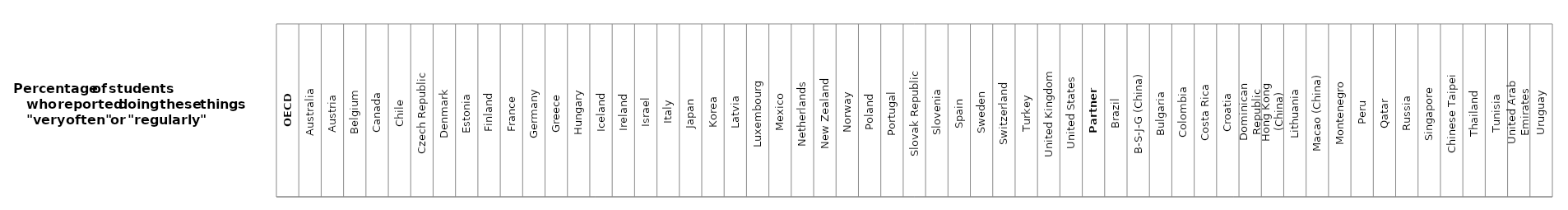
| Category | All countries and economies |
|---|---|
| OECD | 1 |
| Australia | 1 |
| Austria | 1 |
| Belgium | 1 |
| Canada | 1 |
| Chile | 1 |
| Czech Republic | 1 |
| Denmark | 1 |
| Estonia | 1 |
| Finland | 1 |
| France | 1 |
| Germany | 1 |
| Greece | 1 |
| Hungary | 1 |
| Iceland | 1 |
| Ireland | 1 |
| Israel | 1 |
| Italy | 1 |
| Japan | 1 |
| Korea | 1 |
| Latvia | 1 |
| Luxembourg | 1 |
| Mexico | 1 |
| Netherlands | 1 |
| New Zealand | 1 |
| Norway | 1 |
| Poland | 1 |
| Portugal | 1 |
| Slovak Republic | 1 |
| Slovenia | 1 |
| Spain | 1 |
| Sweden | 1 |
| Switzerland | 1 |
| Turkey | 1 |
| United Kingdom | 1 |
| United States | 1 |
| Partners | 1 |
| Brazil | 1 |
| B-S-J-G (China) | 1 |
| Bulgaria | 1 |
| Colombia | 1 |
| Costa Rica | 1 |
| Croatia | 1 |
| Dominican Republic | 1 |
| Hong Kong (China) | 1 |
| Lithuania | 1 |
| Macao (China) | 1 |
| Montenegro | 1 |
| Peru | 1 |
| Qatar | 1 |
| Russia | 1 |
| Singapore | 1 |
| Chinese Taipei | 1 |
| Thailand | 1 |
| Tunisia | 1 |
| United Arab Emirates | 1 |
| Uruguay | 1 |